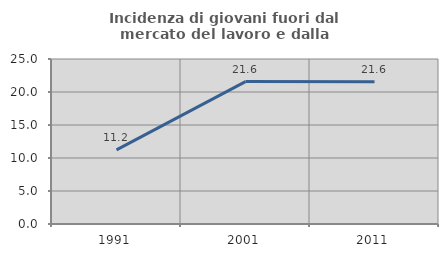
| Category | Incidenza di giovani fuori dal mercato del lavoro e dalla formazione  |
|---|---|
| 1991.0 | 11.23 |
| 2001.0 | 21.577 |
| 2011.0 | 21.556 |